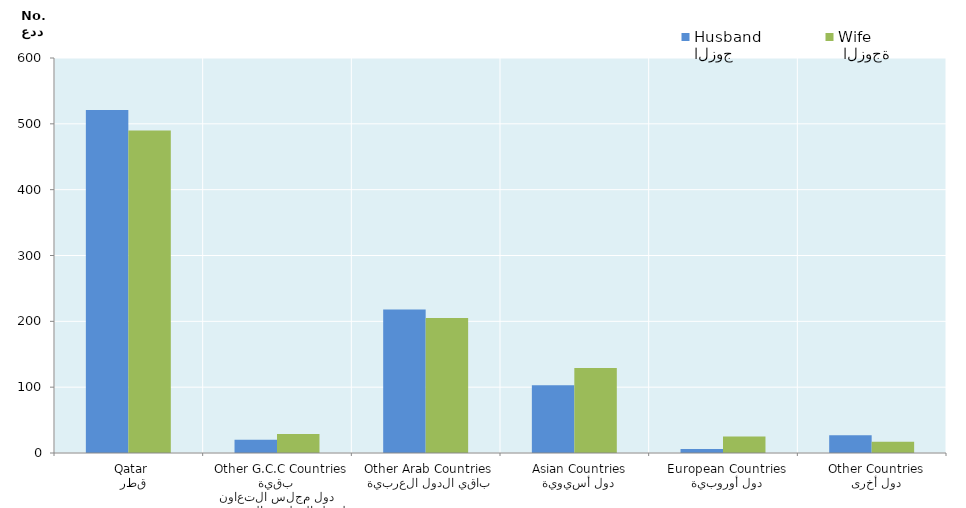
| Category | الزوج
Husband |  الزوجة
Wife |
|---|---|---|
|   قطر
 Qatar | 521 | 490 |
|  بقية دول مجلس التعاون لدول الخليج العربية
  Other G.C.C Countries | 20 | 29 |
|   باقي الدول العربية
 Other Arab Countries | 218 | 205 |
|   دول أسيوية
  Asian Countries | 103 | 129 |
|   دول أوروبية
  European Countries | 6 | 25 |
|   دول أخرى
  Other Countries | 27 | 17 |